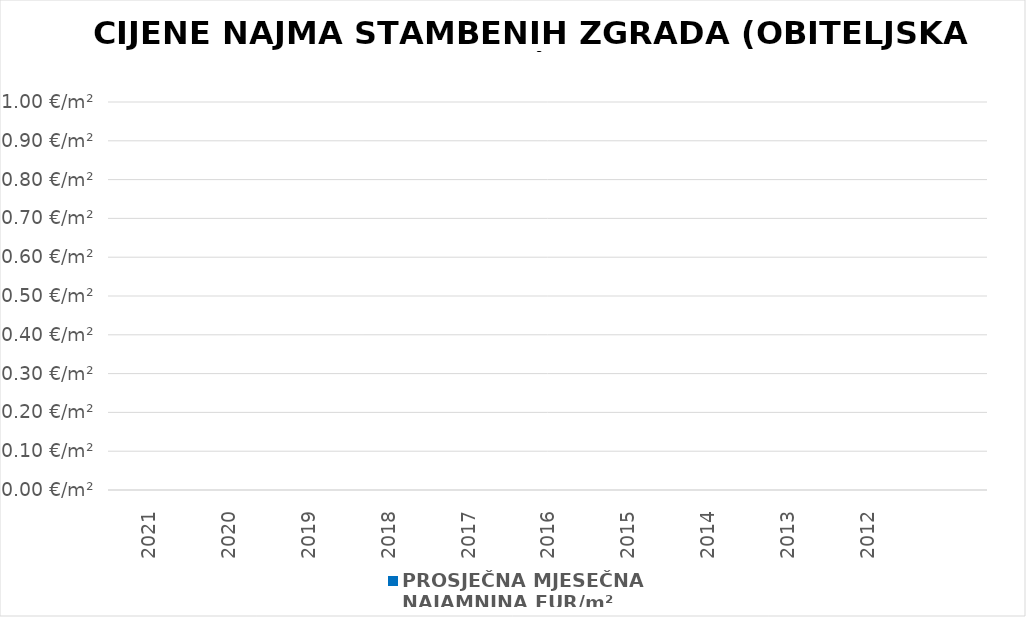
| Category | PROSJEČNA MJESEČNA 
NAJAMNINA EUR/m² |
|---|---|
| 2021 | 0 |
| 2020 | 0 |
| 2019 | 0 |
| 2018 | 0 |
| 2017 | 0 |
| 2016 | 0 |
| 2015 | 0 |
| 2014 | 0 |
| 2013 | 0 |
| 2012 | 0 |